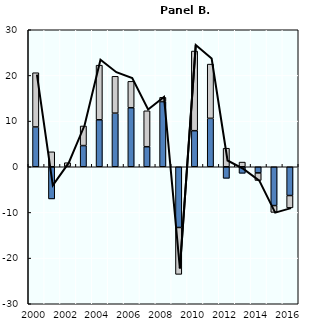
| Category | Precio | Volumen |
|---|---|---|
| 2000.0 | 8.72 | 11.873 |
| 2001.0 | -7.046 | 3.272 |
| 2002.0 | 0.078 | 0.809 |
| 2003.0 | 4.639 | 4.292 |
| 2004.0 | 10.286 | 11.958 |
| 2005.0 | 11.737 | 8.071 |
| 2006.0 | 12.925 | 5.781 |
| 2007.0 | 4.387 | 7.867 |
| 2008.0 | 14.271 | 0.933 |
| 2009.0 | -13.298 | -10.269 |
| 2010.0 | 7.898 | 17.444 |
| 2011.0 | 10.601 | 11.879 |
| 2012.0 | -2.536 | 4.062 |
| 2013.0 | -1.435 | 1.024 |
| 2014.0 | -1.349 | -1.658 |
| 2015.0 | -8.5 | -1.5 |
| 2016.0 | -6.3 | -2.7 |